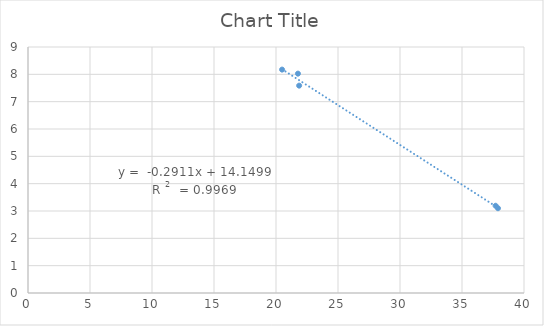
| Category | Series 0 |
|---|---|
| 20.49 | 8.173 |
| 21.866666666666664 | 7.586 |
| 21.77 | 8.025 |
| 37.71 | 3.192 |
| 37.900000000000006 | 3.101 |